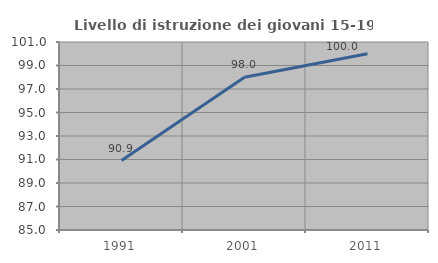
| Category | Livello di istruzione dei giovani 15-19 anni |
|---|---|
| 1991.0 | 90.909 |
| 2001.0 | 98 |
| 2011.0 | 100 |